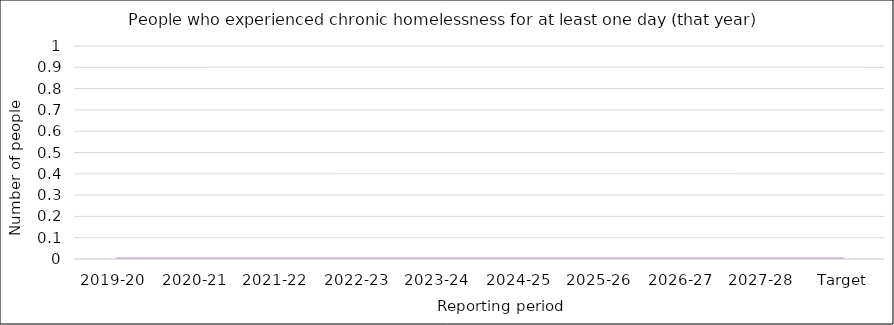
| Category | Series 0 |
|---|---|
| 2019-20 | 0 |
| 2020-21 | 0 |
| 2021-22 | 0 |
| 2022-23 | 0 |
| 2023-24 | 0 |
| 2024-25 | 0 |
| 2025-26 | 0 |
| 2026-27 | 0 |
| 2027-28 | 0 |
| Target | 0 |